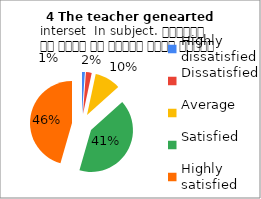
| Category | 4 The teacher genearted
interset  In subject. शिक्षक ने विषय के प्रति रुचि जागृत की |
|---|---|
| Highly dissatisfied | 1 |
| Dissatisfied | 2 |
| Average | 9 |
| Satisfied | 37 |
| Highly satisfied | 41 |